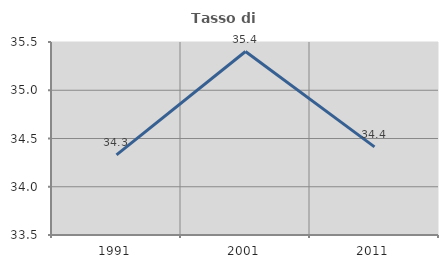
| Category | Tasso di occupazione   |
|---|---|
| 1991.0 | 34.331 |
| 2001.0 | 35.401 |
| 2011.0 | 34.413 |